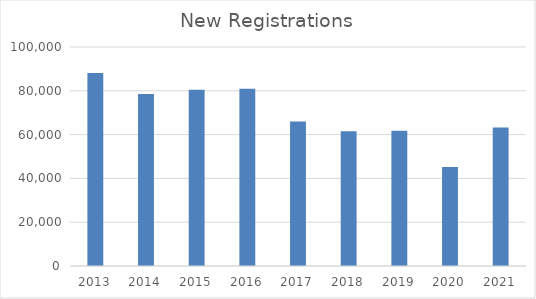
| Category | Sum of New Registrations |
|---|---|
| 2013 | 88112 |
| 2014 | 78540 |
| 2015 | 80492 |
| 2016 | 80993 |
| 2017 | 66023 |
| 2018 | 61525 |
| 2019 | 61766 |
| 2020 | 45198 |
| 2021 | 63271 |